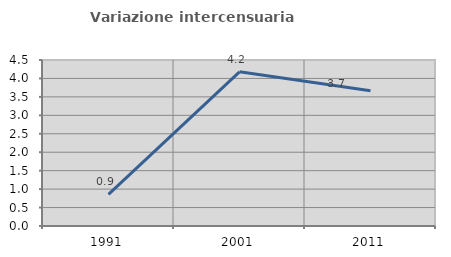
| Category | Variazione intercensuaria annua |
|---|---|
| 1991.0 | 0.856 |
| 2001.0 | 4.18 |
| 2011.0 | 3.665 |